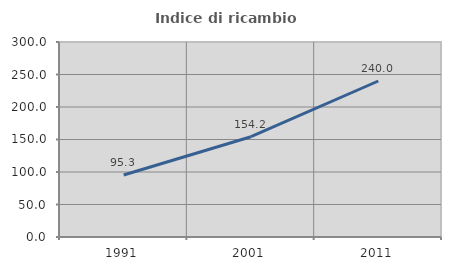
| Category | Indice di ricambio occupazionale  |
|---|---|
| 1991.0 | 95.312 |
| 2001.0 | 154.237 |
| 2011.0 | 240 |